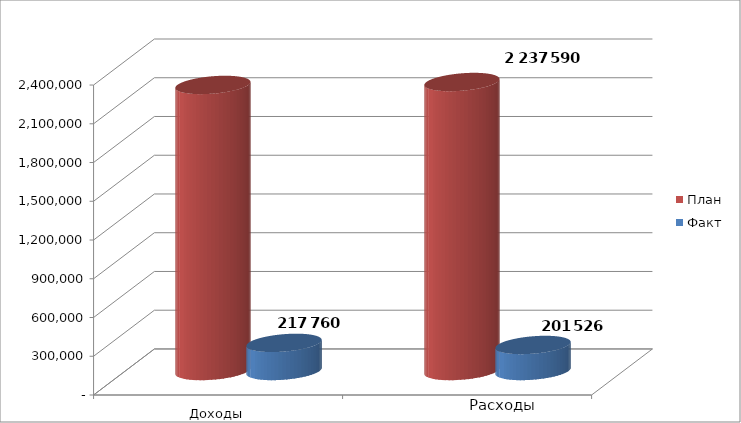
| Category | План | Факт |
|---|---|---|
| 0 | 2214939 | 217760 |
| 1 | 2237590 | 201526 |